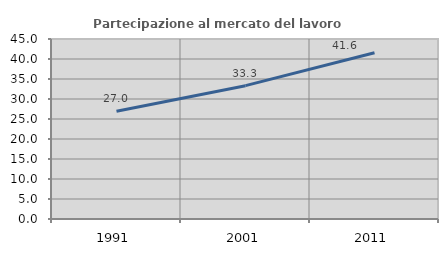
| Category | Partecipazione al mercato del lavoro  femminile |
|---|---|
| 1991.0 | 26.95 |
| 2001.0 | 33.333 |
| 2011.0 | 41.573 |